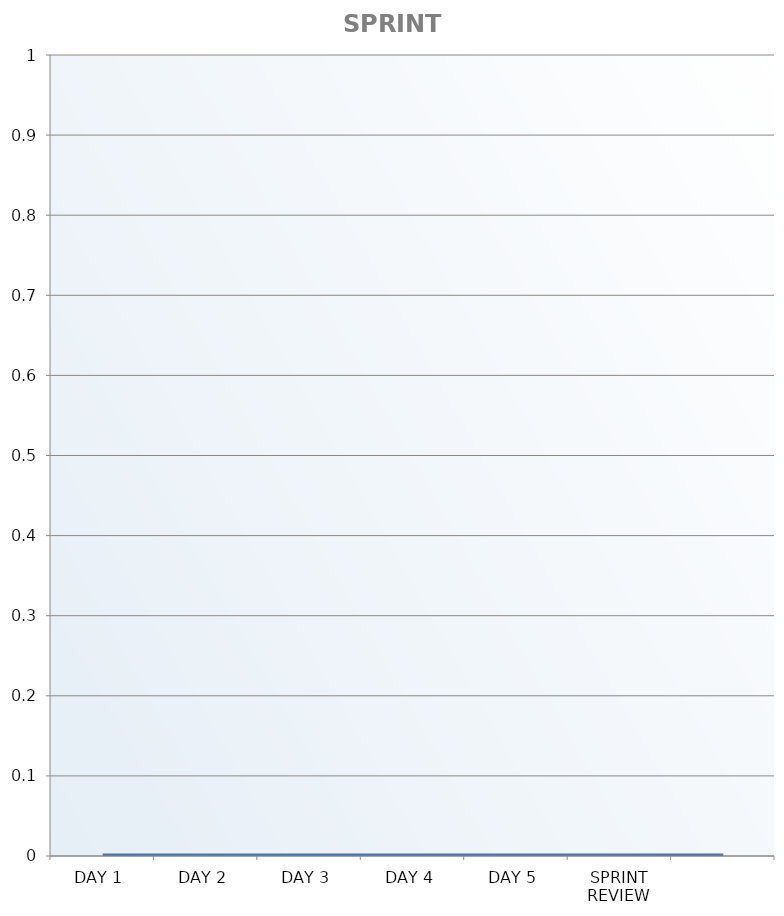
| Category | Sprint Burndown Chart |
|---|---|
| DAY 1 | 0 |
| DAY 2 | 0 |
| DAY 3 | 0 |
| DAY 4 | 0 |
| DAY 5 | 0 |
| SPRINT REVIEW | 0 |